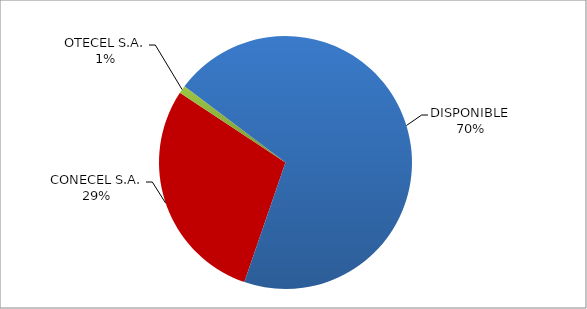
| Category | CÓDIGO DE RED 96 |
|---|---|
| CONECEL S.A. | 0.29 |
| OTECEL S.A. | 0.01 |
| DISPONIBLE | 0.7 |